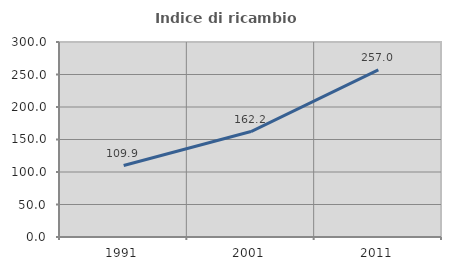
| Category | Indice di ricambio occupazionale  |
|---|---|
| 1991.0 | 109.917 |
| 2001.0 | 162.234 |
| 2011.0 | 257.042 |